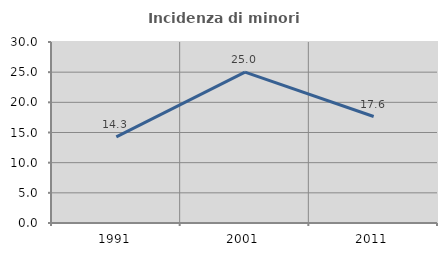
| Category | Incidenza di minori stranieri |
|---|---|
| 1991.0 | 14.286 |
| 2001.0 | 25 |
| 2011.0 | 17.647 |